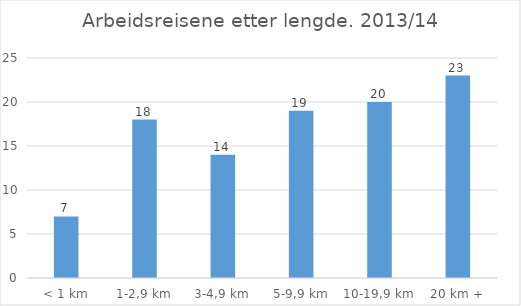
| Category | Andel reiser (i %) |
|---|---|
| < 1 km | 7 |
| 1-2,9 km | 18 |
| 3-4,9 km | 14 |
| 5-9,9 km | 19 |
| 10-19,9 km | 20 |
| 20 km + | 23 |